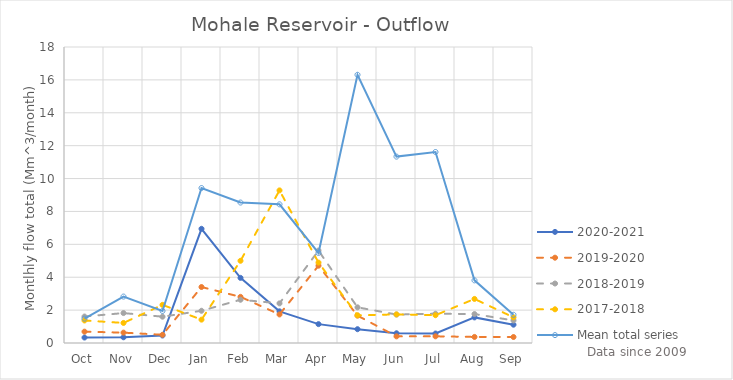
| Category | 2020-2021 | 2019-2020 | 2018-2019 | 2017-2018 | Mean total series |
|---|---|---|---|---|---|
| Oct | 0.333 | 0.69 | 1.61 | 1.37 | 1.482 |
| Nov | 0.348 | 0.63 | 1.82 | 1.22 | 2.824 |
| Dec | 0.456 | 0.5 | 1.6 | 2.32 | 1.947 |
| Jan | 6.944 | 3.405 | 1.96 | 1.42 | 9.423 |
| Feb | 3.961 | 2.806 | 2.63 | 5 | 8.541 |
| Mar | 1.926 | 1.737 | 2.41 | 9.28 | 8.432 |
| Apr | 1.148 | 4.701 | 5.62 | 4.89 | 5.478 |
| May | 0.839 | 1.666 | 2.17 | 1.68 | 16.311 |
| Jun | 0.592 | 0.404 | 1.73 | 1.74 | 11.334 |
| Jul | 0.576 | 0.407 | 1.78 | 1.69 | 11.615 |
| Aug | 1.556 | 0.369 | 1.76 | 2.68 | 3.81 |
| Sep | 1.113 | 0.364 | 1.37 | 1.56 | 1.716 |